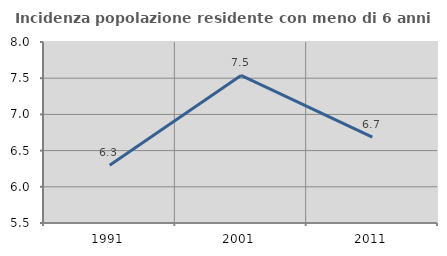
| Category | Incidenza popolazione residente con meno di 6 anni |
|---|---|
| 1991.0 | 6.296 |
| 2001.0 | 7.538 |
| 2011.0 | 6.687 |